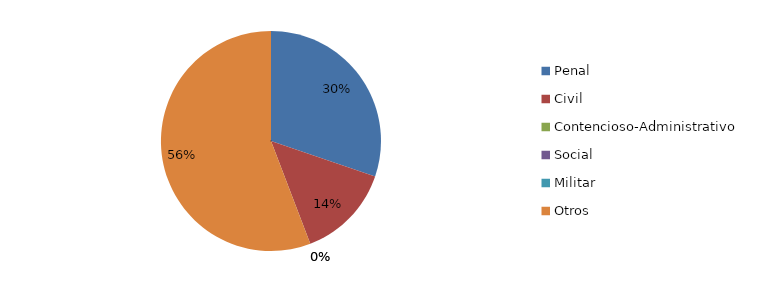
| Category | Series 0 |
|---|---|
| Penal | 13 |
| Civil | 6 |
| Contencioso-Administrativo | 0 |
| Social | 0 |
| Militar | 0 |
| Otros | 24 |